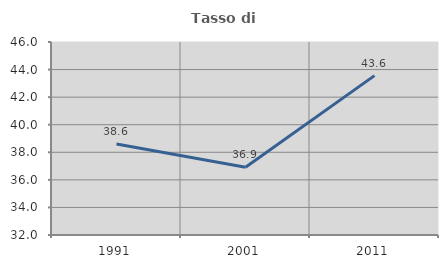
| Category | Tasso di occupazione   |
|---|---|
| 1991.0 | 38.598 |
| 2001.0 | 36.918 |
| 2011.0 | 43.562 |